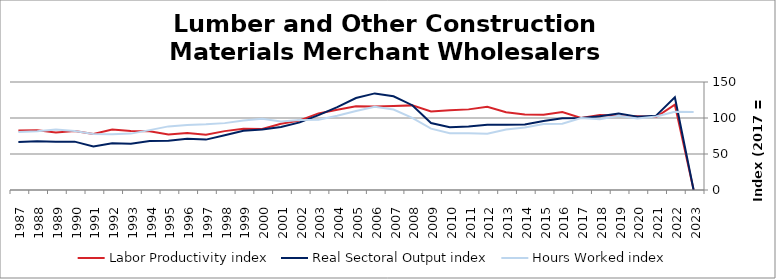
| Category | Labor Productivity index | Real Sectoral Output index | Hours Worked index |
|---|---|---|---|
| 2023.0 | 0 | 0 | 108.248 |
| 2022.0 | 118.45 | 128.715 | 108.667 |
| 2021.0 | 101.272 | 103.275 | 101.979 |
| 2020.0 | 102.575 | 101.847 | 99.29 |
| 2019.0 | 103.072 | 106.1 | 102.938 |
| 2018.0 | 104.189 | 102.331 | 98.216 |
| 2017.0 | 100 | 100 | 100 |
| 2016.0 | 108.205 | 99.55 | 92.001 |
| 2015.0 | 104.494 | 95.767 | 91.648 |
| 2014.0 | 104.853 | 90.969 | 86.759 |
| 2013.0 | 108.036 | 90.737 | 83.988 |
| 2012.0 | 115.701 | 90.498 | 78.217 |
| 2011.0 | 111.977 | 88.22 | 78.785 |
| 2010.0 | 110.719 | 87.238 | 78.793 |
| 2009.0 | 109.099 | 93.039 | 85.279 |
| 2008.0 | 117.532 | 117.747 | 100.183 |
| 2007.0 | 116.573 | 130.222 | 111.709 |
| 2006.0 | 115.96 | 134.166 | 115.7 |
| 2005.0 | 116.423 | 127.731 | 109.712 |
| 2004.0 | 111.545 | 115.111 | 103.197 |
| 2003.0 | 106.373 | 103.921 | 97.694 |
| 2002.0 | 96.493 | 93.891 | 97.304 |
| 2001.0 | 91.932 | 87.449 | 95.124 |
| 2000.0 | 84.708 | 83.89 | 99.034 |
| 1999.0 | 84.966 | 82.139 | 96.673 |
| 1998.0 | 81.781 | 75.958 | 92.88 |
| 1997.0 | 76.767 | 69.979 | 91.157 |
| 1996.0 | 79.045 | 71.26 | 90.15 |
| 1995.0 | 77.251 | 68.262 | 88.364 |
| 1994.0 | 81.734 | 67.978 | 83.169 |
| 1993.0 | 81.964 | 64.189 | 78.313 |
| 1992.0 | 83.92 | 65.079 | 77.549 |
| 1991.0 | 77.941 | 60.546 | 77.682 |
| 1990.0 | 81.924 | 67.145 | 81.96 |
| 1989.0 | 79.761 | 66.951 | 83.939 |
| 1988.0 | 83.05 | 67.758 | 81.587 |
| 1987.0 | 82.708 | 66.651 | 80.585 |